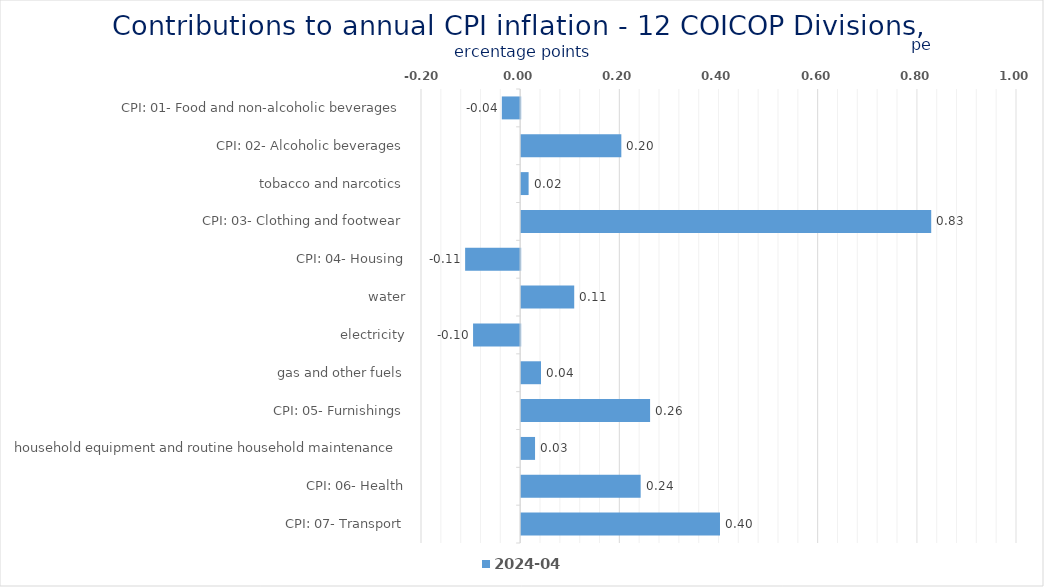
| Category | 2024-04 |
|---|---|
| CPI: 01- Food and non-alcoholic beverages | -0.037 |
| CPI: 02- Alcoholic beverages, tobacco and narcotics | 0.202 |
| CPI: 03- Clothing and footwear | 0.015 |
| CPI: 04- Housing, water, electricity, gas and other fuels | 0.827 |
| CPI: 05- Furnishings, household equipment and routine household maintenance | -0.111 |
| CPI: 06- Health | 0.107 |
| CPI: 07- Transport | -0.095 |
| CPI: 08- Communication | 0.04 |
| CPI: 09- Recreation and culture | 0.26 |
| CPI: 10- Education | 0.028 |
| CPI: 11- Restaurants and hotels | 0.241 |
| CPI: 12- Miscellaneous goods and services | 0.401 |